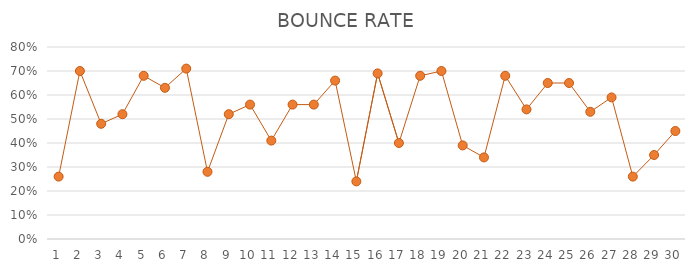
| Category | BOUNCE RATE |
|---|---|
| 1.0 | 0.26 |
| 2.0 | 0.7 |
| 3.0 | 0.48 |
| 4.0 | 0.52 |
| 5.0 | 0.68 |
| 6.0 | 0.63 |
| 7.0 | 0.71 |
| 8.0 | 0.28 |
| 9.0 | 0.52 |
| 10.0 | 0.56 |
| 11.0 | 0.41 |
| 12.0 | 0.56 |
| 13.0 | 0.56 |
| 14.0 | 0.66 |
| 15.0 | 0.24 |
| 16.0 | 0.69 |
| 17.0 | 0.4 |
| 18.0 | 0.68 |
| 19.0 | 0.7 |
| 20.0 | 0.39 |
| 21.0 | 0.34 |
| 22.0 | 0.68 |
| 23.0 | 0.54 |
| 24.0 | 0.65 |
| 25.0 | 0.65 |
| 26.0 | 0.53 |
| 27.0 | 0.59 |
| 28.0 | 0.26 |
| 29.0 | 0.35 |
| 30.0 | 0.45 |